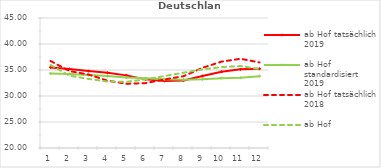
| Category | ab Hof tatsächlich 2019 | ab Hof standardisiert 2019 | ab Hof tatsächlich 2018 | ab Hof standardisiert 2018 |
|---|---|---|---|---|
| 0 | 35.503 | 34.324 | 36.74 | 35.978 |
| 1 | 35.198 | 34.223 | 34.791 | 33.912 |
| 2 | 34.795 | 34.029 | 34.128 | 33.286 |
| 3 | 34.47 | 33.826 | 32.949 | 32.785 |
| 4 | 33.966 | 33.549 | 32.357 | 32.721 |
| 5 | 33.196 | 33.408 | 32.477 | 33.196 |
| 6 | 32.906 | 33.235 | 33.178 | 33.831 |
| 7 | 32.98 | 33.138 | 33.807 | 34.482 |
| 8 | 33.831 | 33.229 | 35.418 | 35.122 |
| 9 | 34.675 | 33.434 | 36.606 | 35.558 |
| 10 | 35.125 | 33.528 | 37.161 | 35.762 |
| 11 | 35.238 | 33.821 | 36.461 | 35.179 |